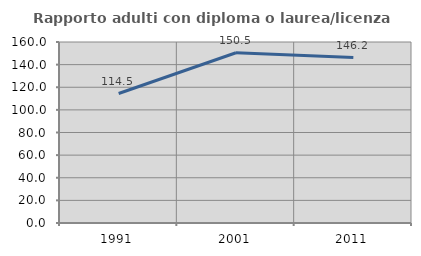
| Category | Rapporto adulti con diploma o laurea/licenza media  |
|---|---|
| 1991.0 | 114.458 |
| 2001.0 | 150.505 |
| 2011.0 | 146.226 |